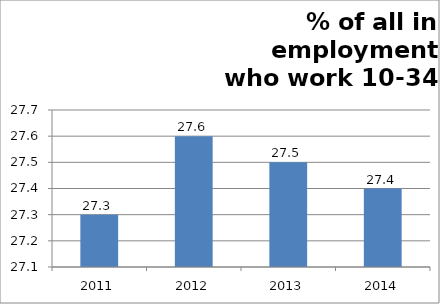
| Category | % of all in employment who work 10-34 hours |
|---|---|
| 2011.0 | 27.3 |
| 2012.0 | 27.6 |
| 2013.0 | 27.5 |
| 2014.0 | 27.4 |